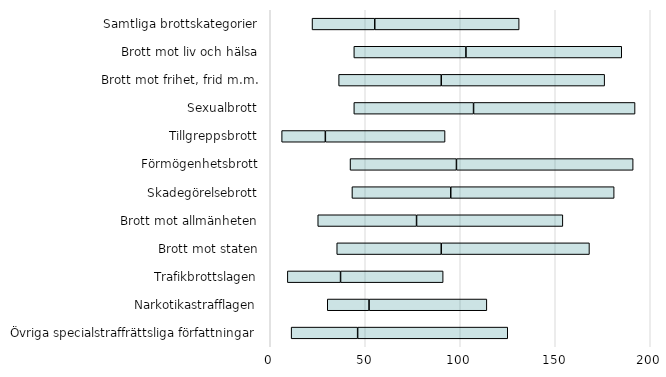
| Category | KV1 | KV2 | KV3 |
|---|---|---|---|
| Övriga specialstraffrättsliga författningar | 11 | 35 | 79 |
| Narkotikastrafflagen | 30 | 22 | 62 |
| Trafikbrottslagen | 9 | 28 | 54 |
| Brott mot staten | 35 | 55 | 78 |
| Brott mot allmänheten | 25 | 52 | 77 |
| Skadegörelsebrott | 43 | 52 | 86 |
| Förmögenhetsbrott | 42 | 56 | 93 |
| Tillgreppsbrott | 6 | 23 | 63 |
| Sexualbrott | 44 | 63 | 85 |
| Brott mot frihet, frid m.m. | 36 | 54 | 86 |
| Brott mot liv och hälsa | 44 | 59 | 82 |
| Samtliga brottskategorier | 22 | 33 | 76 |